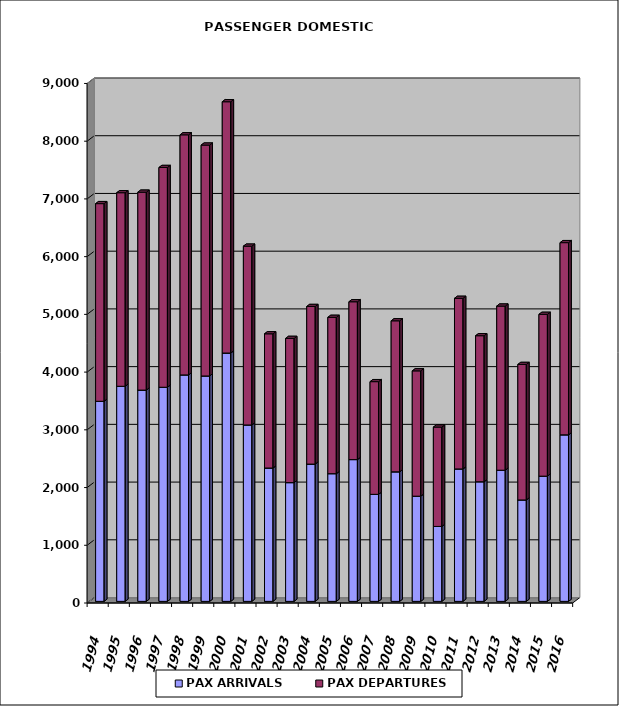
| Category | PAX ARRIVALS | PAX DEPARTURES |
|---|---|---|
| 1994.0 | 3466 | 3424 |
| 1995.0 | 3726 | 3353 |
| 1996.0 | 3660 | 3428 |
| 1997.0 | 3709 | 3807 |
| 1998.0 | 3923 | 4159 |
| 1999.0 | 3905 | 3999 |
| 2000.0 | 4302 | 4353 |
| 2001.0 | 3056 | 3097 |
| 2002.0 | 2310 | 2325 |
| 2003.0 | 2057 | 2498 |
| 2004.0 | 2378 | 2730 |
| 2005.0 | 2212 | 2708 |
| 2006.0 | 2456 | 2734 |
| 2007.0 | 1854 | 1952 |
| 2008.0 | 2244 | 2616 |
| 2009.0 | 1822 | 2171 |
| 2010.0 | 1298 | 1721 |
| 2011.0 | 2294 | 2955 |
| 2012.0 | 2072 | 2530 |
| 2013.0 | 2272 | 2843 |
| 2014.0 | 1757 | 2347 |
| 2015.0 | 2169 | 2803 |
| 2016.0 | 2885 | 3329 |